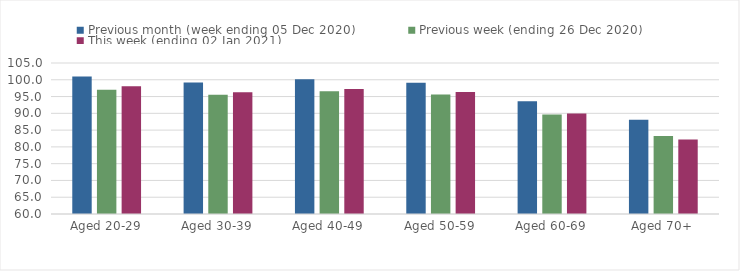
| Category | Previous month (week ending 05 Dec 2020) | Previous week (ending 26 Dec 2020) | This week (ending 02 Jan 2021) |
|---|---|---|---|
| Aged 20-29 | 100.96 | 97.06 | 98.06 |
| Aged 30-39 | 99.16 | 95.51 | 96.28 |
| Aged 40-49 | 100.17 | 96.57 | 97.25 |
| Aged 50-59 | 99.15 | 95.63 | 96.36 |
| Aged 60-69 | 93.57 | 89.64 | 89.93 |
| Aged 70+ | 88.12 | 83.25 | 82.17 |